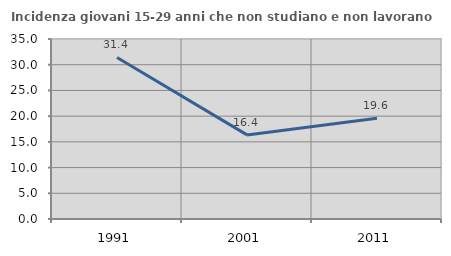
| Category | Incidenza giovani 15-29 anni che non studiano e non lavorano  |
|---|---|
| 1991.0 | 31.414 |
| 2001.0 | 16.352 |
| 2011.0 | 19.601 |